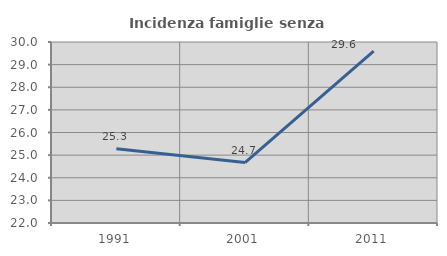
| Category | Incidenza famiglie senza nuclei |
|---|---|
| 1991.0 | 25.286 |
| 2001.0 | 24.672 |
| 2011.0 | 29.592 |